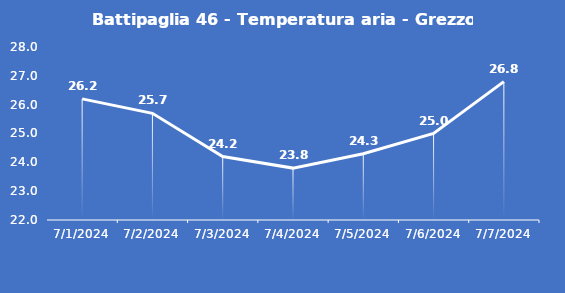
| Category | Battipaglia 46 - Temperatura aria - Grezzo (°C) |
|---|---|
| 7/1/24 | 26.2 |
| 7/2/24 | 25.7 |
| 7/3/24 | 24.2 |
| 7/4/24 | 23.8 |
| 7/5/24 | 24.3 |
| 7/6/24 | 25 |
| 7/7/24 | 26.8 |